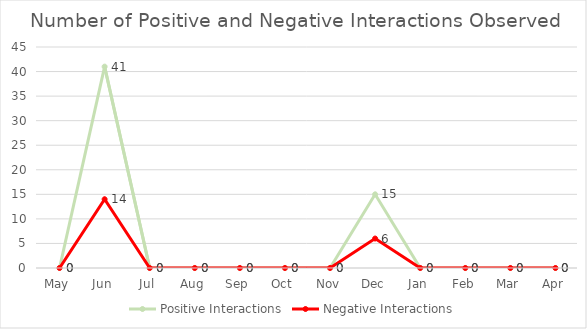
| Category | Positive Interactions | Negative Interactions |
|---|---|---|
| May | 0 | 0 |
| Jun | 41 | 14 |
| Jul | 0 | 0 |
| Aug | 0 | 0 |
| Sep | 0 | 0 |
| Oct | 0 | 0 |
| Nov | 0 | 0 |
| Dec | 15 | 6 |
| Jan | 0 | 0 |
| Feb | 0 | 0 |
| Mar | 0 | 0 |
| Apr | 0 | 0 |